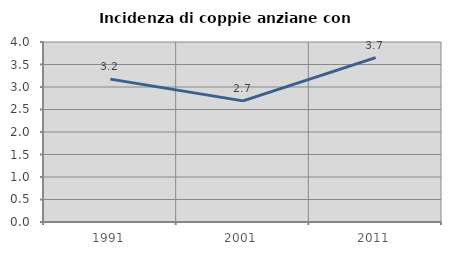
| Category | Incidenza di coppie anziane con figli |
|---|---|
| 1991.0 | 3.175 |
| 2001.0 | 2.692 |
| 2011.0 | 3.654 |